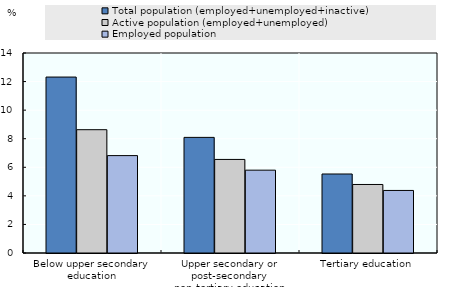
| Category | Total population (employed+unemployed+inactive) | Active population (employed+unemployed) | Employed population |
|---|---|---|---|
| Below upper secondary education | 12.316 | 8.631 | 6.818 |
| Upper secondary or post-secondary non-tertiary education | 8.093 | 6.55 | 5.798 |
| Tertiary education | 5.53 | 4.797 | 4.378 |